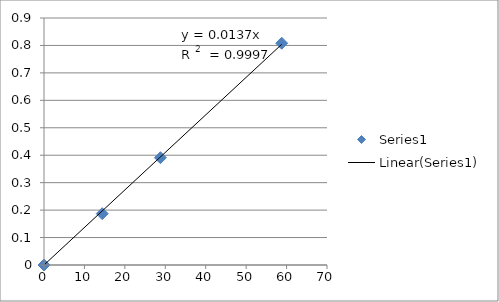
| Category | Series 0 |
|---|---|
| 0.0 | 0 |
| 14.4 | 0.187 |
| 28.8 | 0.391 |
| 58.8 | 0.808 |